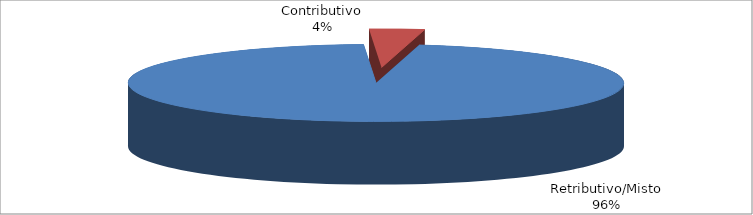
| Category | Decorrenti gennaio - giugno 2022 |
|---|---|
| Retributivo/Misto | 16873 |
| Contributivo | 627 |